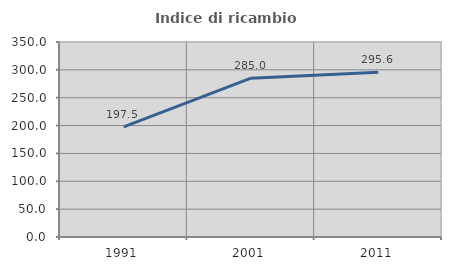
| Category | Indice di ricambio occupazionale  |
|---|---|
| 1991.0 | 197.549 |
| 2001.0 | 285.027 |
| 2011.0 | 295.588 |